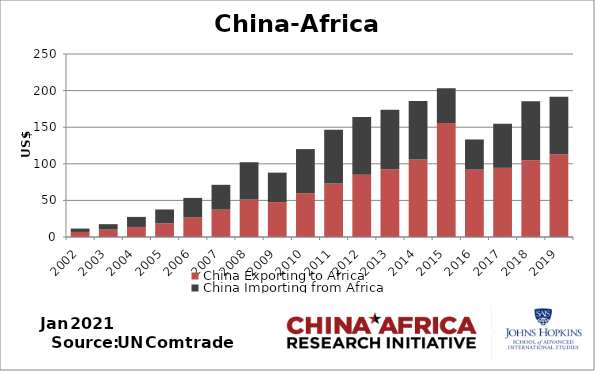
| Category | China Exporting to Africa | China Importing from Africa |
|---|---|---|
| 2002.0 | 6.918 | 4.609 |
| 2003.0 | 10.125 | 7.409 |
| 2004.0 | 13.73 | 13.74 |
| 2005.0 | 18.603 | 18.987 |
| 2006.0 | 26.584 | 26.794 |
| 2007.0 | 37.373 | 33.911 |
| 2008.0 | 51.089 | 51.042 |
| 2009.0 | 47.635 | 40.307 |
| 2010.0 | 59.807 | 60.266 |
| 2011.0 | 72.919 | 73.634 |
| 2012.0 | 85.134 | 78.911 |
| 2013.0 | 92.571 | 81.113 |
| 2014.0 | 105.833 | 79.859 |
| 2015.0 | 155.696 | 47.527 |
| 2016.0 | 91.985 | 41.273 |
| 2017.0 | 94.499 | 60.21 |
| 2018.0 | 104.949 | 80.337 |
| 2019.0 | 113.051 | 78.683 |